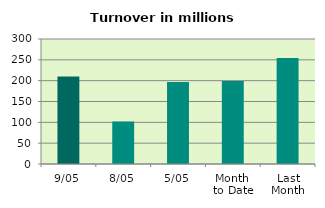
| Category | Series 0 |
|---|---|
| 9/05 | 210.299 |
| 8/05 | 102.198 |
| 5/05 | 196.834 |
| Month 
to Date | 199.48 |
| Last
Month | 254.458 |